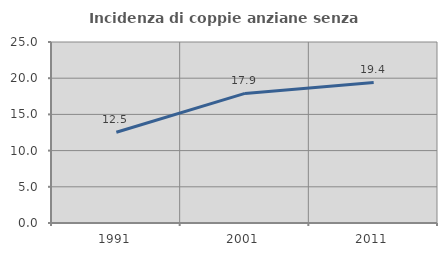
| Category | Incidenza di coppie anziane senza figli  |
|---|---|
| 1991.0 | 12.53 |
| 2001.0 | 17.901 |
| 2011.0 | 19.413 |